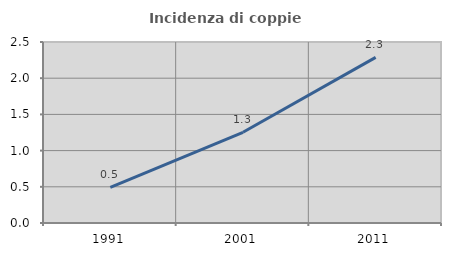
| Category | Incidenza di coppie miste |
|---|---|
| 1991.0 | 0.491 |
| 2001.0 | 1.253 |
| 2011.0 | 2.288 |